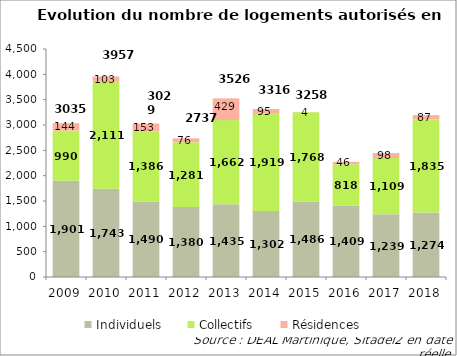
| Category | Individuels | Collectifs | Résidences |
|---|---|---|---|
| 2009 | 1901 | 990 | 144 |
| 2010 | 1743 | 2111 | 103 |
| 2011 | 1490 | 1386 | 153 |
| 2012 | 1380 | 1281 | 76 |
| 2013 | 1435 | 1662 | 429 |
| 2014 | 1302 | 1919 | 95 |
| 2015 | 1486 | 1768 | 4 |
| 2016 | 1409 | 818 | 46 |
| 2017 | 1239 | 1109 | 98 |
| 2018 | 1274 | 1835 | 87 |